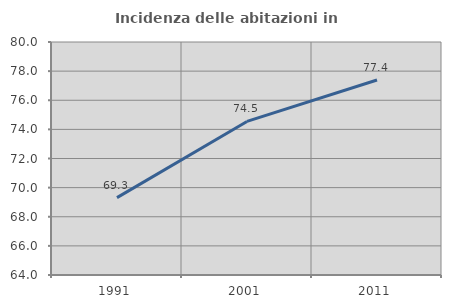
| Category | Incidenza delle abitazioni in proprietà  |
|---|---|
| 1991.0 | 69.313 |
| 2001.0 | 74.545 |
| 2011.0 | 77.388 |